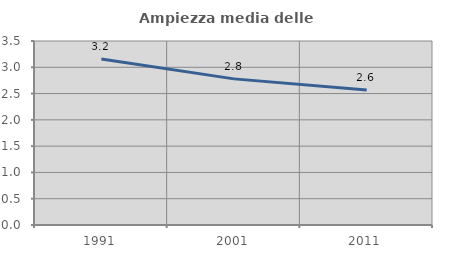
| Category | Ampiezza media delle famiglie |
|---|---|
| 1991.0 | 3.158 |
| 2001.0 | 2.78 |
| 2011.0 | 2.57 |